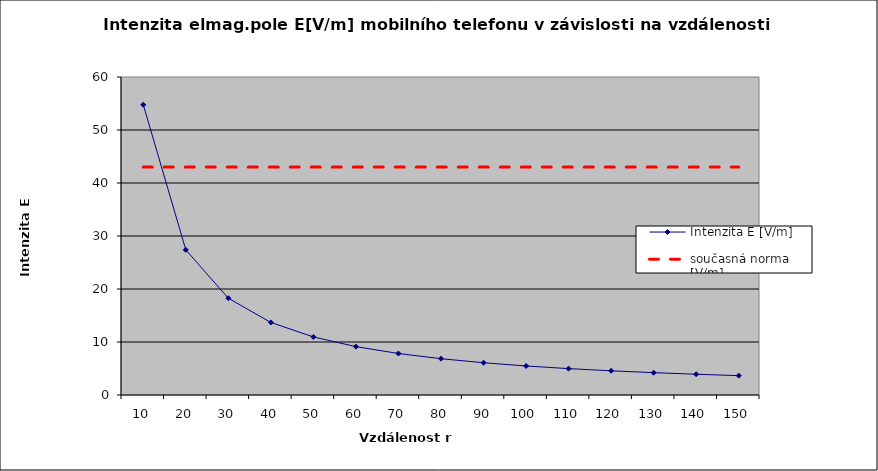
| Category | Intenzita E [V/m] | současná norma [V/m] |
|---|---|---|
| 10.0 | 54.772 | 43 |
| 20.0 | 27.386 | 43 |
| 30.0 | 18.257 | 43 |
| 40.0 | 13.693 | 43 |
| 50.0 | 10.954 | 43 |
| 60.0 | 9.129 | 43 |
| 70.0 | 7.825 | 43 |
| 80.0 | 6.847 | 43 |
| 90.0 | 6.086 | 43 |
| 100.0 | 5.477 | 43 |
| 110.0 | 4.979 | 43 |
| 120.0 | 4.564 | 43 |
| 130.0 | 4.213 | 43 |
| 140.0 | 3.912 | 43 |
| 150.0 | 3.651 | 43 |